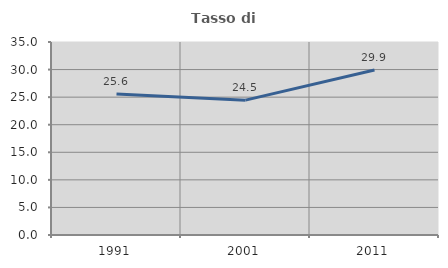
| Category | Tasso di occupazione   |
|---|---|
| 1991.0 | 25.579 |
| 2001.0 | 24.458 |
| 2011.0 | 29.929 |